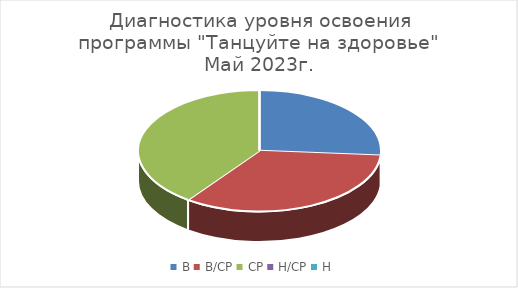
| Category | Series 0 |
|---|---|
| В | 21 |
| В/СР | 27 |
| СР | 32 |
| Н/СР | 0 |
| Н | 0 |